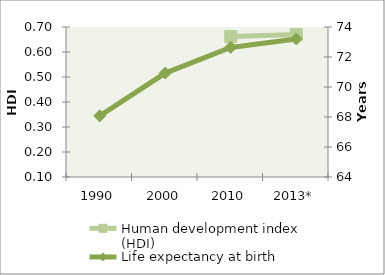
| Category | Human development index (HDI) |
|---|---|
| 1990 | 0 |
| 2000 | 0 |
| 2010 | 0.662 |
| 2013* | 0.67 |